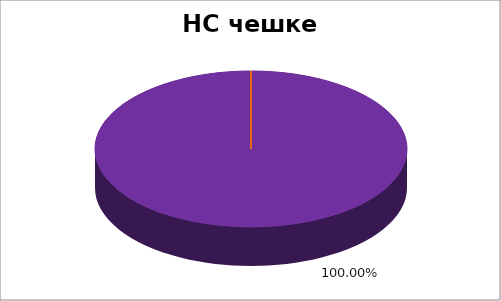
| Category | НС чешке НМ |
|---|---|
| 0 | 0 |
| 1 | 0 |
| 2 | 0 |
| 3 | 0 |
| 4 | 1 |